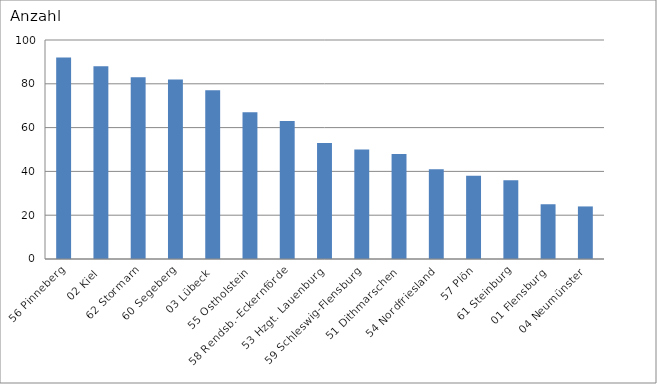
| Category | 56 Pinneberg 02 Kiel 62 Stormarn 60 Segeberg 03 Lübeck 55 Ostholstein 58 Rendsb.-Eckernförde 53 Hzgt. Lauenburg 59 Schleswig-Flensburg 51 Dithmarschen 54 Nordfriesland 57 Plön 61 Steinburg 01 Flensburg 04 Neumünster |
|---|---|
| 56 Pinneberg | 92 |
| 02 Kiel | 88 |
| 62 Stormarn | 83 |
| 60 Segeberg | 82 |
| 03 Lübeck | 77 |
| 55 Ostholstein | 67 |
| 58 Rendsb.-Eckernförde | 63 |
| 53 Hzgt. Lauenburg | 53 |
| 59 Schleswig-Flensburg | 50 |
| 51 Dithmarschen | 48 |
| 54 Nordfriesland | 41 |
| 57 Plön | 38 |
| 61 Steinburg | 36 |
| 01 Flensburg | 25 |
| 04 Neumünster | 24 |